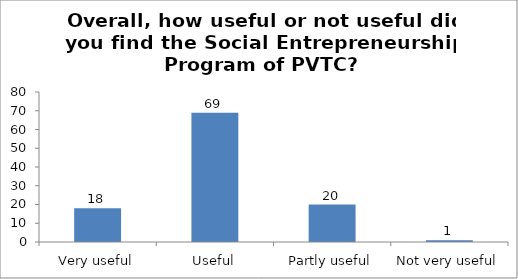
| Category | Overall, how useful or not useful did you find the Social Entrepreneurship program of PVTC? |
|---|---|
| Very useful | 18 |
| Useful | 69 |
| Partly useful | 20 |
| Not very useful | 1 |